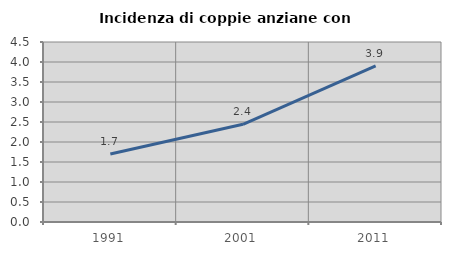
| Category | Incidenza di coppie anziane con figli |
|---|---|
| 1991.0 | 1.701 |
| 2001.0 | 2.444 |
| 2011.0 | 3.901 |